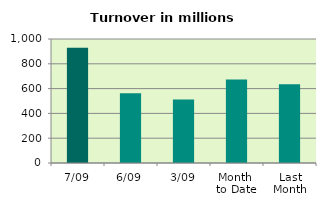
| Category | Series 0 |
|---|---|
| 7/09 | 928.579 |
| 6/09 | 561.697 |
| 3/09 | 512.374 |
| Month 
to Date | 673.459 |
| Last
Month | 635.477 |